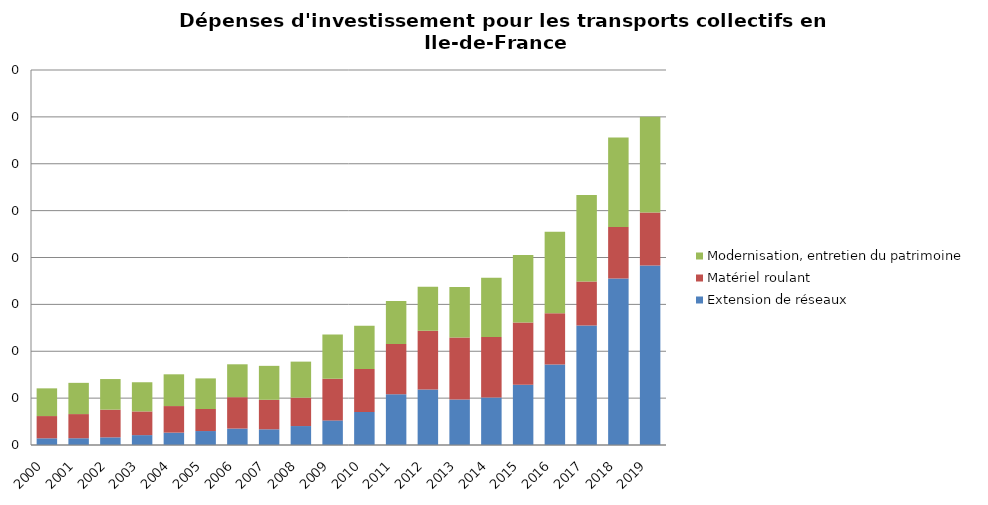
| Category | Extension de réseaux | Matériel roulant | Modernisation, entretien du patrimoine |
|---|---|---|---|
| 2000.0 | 142684061.833 | 474667722.378 | 591041646.991 |
| 2001.0 | 143946094.557 | 515658200.001 | 666246615.53 |
| 2002.0 | 163404359.231 | 590992653.473 | 652663855.568 |
| 2003.0 | 210851276.143 | 505530598.085 | 622216475.994 |
| 2004.0 | 264005416.301 | 566561375.538 | 677529307.226 |
| 2005.0 | 297786868.506 | 470304510.057 | 652814163.35 |
| 2006.0 | 350716954.616 | 669511060.212 | 701561929.527 |
| 2007.0 | 334895138.608 | 629591921.038 | 724105668.5 |
| 2008.0 | 404345374.454 | 605882670.737 | 768448643.278 |
| 2009.0 | 525268597.53 | 887425705.876 | 945983096.283 |
| 2010.0 | 705346720.152 | 917460700.409 | 921995841.731 |
| 2011.0 | 1083174580.507 | 1073846893.997 | 913001460.862 |
| 2012.0 | 1182111718.187 | 1257761532.022 | 938090774.273 |
| 2013.0 | 970753490.137 | 1322981346.338 | 1076523208.023 |
| 2014.0 | 1014896802.077 | 1290637191.146 | 1264574268.038 |
| 2015.0 | 1284485343.463 | 1328488196.456 | 1438603413.943 |
| 2016.0 | 1718816678.512 | 1093905415.048 | 1734420388.574 |
| 2017.0 | 2547787662.149 | 941279022.65 | 1846485595.026 |
| 2018.0 | 3553319268.349 | 1097505690.209 | 1909338594.455 |
| 2019.0 | 3827733232.46 | 1131603263.09 | 2042975760.104 |